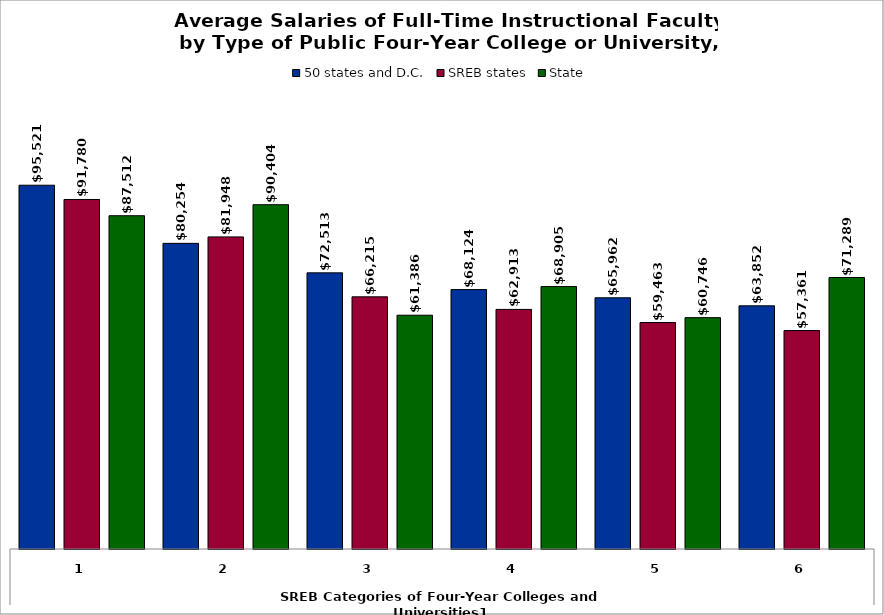
| Category | 50 states and D.C. | SREB states | State |
|---|---|---|---|
| 0 | 95521.438 | 91780.138 | 87512.112 |
| 1 | 80253.647 | 81947.531 | 90403.623 |
| 2 | 72512.764 | 66215.017 | 61386.019 |
| 3 | 68123.575 | 62912.995 | 68905.407 |
| 4 | 65961.984 | 59462.544 | 60746.054 |
| 5 | 63851.891 | 57361.093 | 71288.869 |